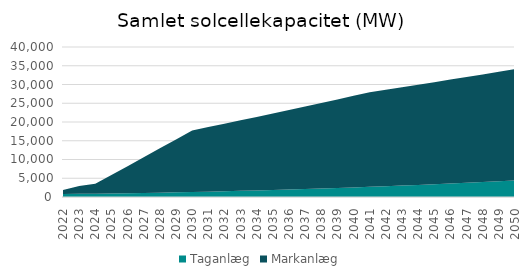
| Category | Taganlæg | Markanlæg |
|---|---|---|
| 2022.0 | 792.34 | 1060.37 |
| 2023.0 | 838.64 | 2110.37 |
| 2024.0 | 891.06 | 2610.37 |
| 2025.0 | 949.59 | 4910.37 |
| 2026.0 | 1014.25 | 7210.37 |
| 2027.0 | 1085.02 | 9510.37 |
| 2028.0 | 1161.91 | 11810.37 |
| 2029.0 | 1244.92 | 14110.37 |
| 2030.0 | 1334.04 | 16410.37 |
| 2031.0 | 1429.28 | 17210.37 |
| 2032.0 | 1530.64 | 18010.37 |
| 2033.0 | 1638.12 | 18810.37 |
| 2034.0 | 1751.71 | 19610.37 |
| 2035.0 | 1871.43 | 20410.37 |
| 2036.0 | 1997.26 | 21210.37 |
| 2037.0 | 2129.21 | 22010.37 |
| 2038.0 | 2267.27 | 22810.37 |
| 2039.0 | 2411.46 | 23610.37 |
| 2040.0 | 2561.76 | 24410.37 |
| 2041.0 | 2718.18 | 25210.37 |
| 2042.0 | 2880.71 | 25710.37 |
| 2043.0 | 3049.37 | 26210.37 |
| 2044.0 | 3224.14 | 26710.37 |
| 2045.0 | 3405.03 | 27210.37 |
| 2046.0 | 3592.04 | 27710.37 |
| 2047.0 | 3785.16 | 28210.37 |
| 2048.0 | 3984.41 | 28710.37 |
| 2049.0 | 4189.77 | 29210.37 |
| 2050.0 | 4401.24 | 29710.37 |